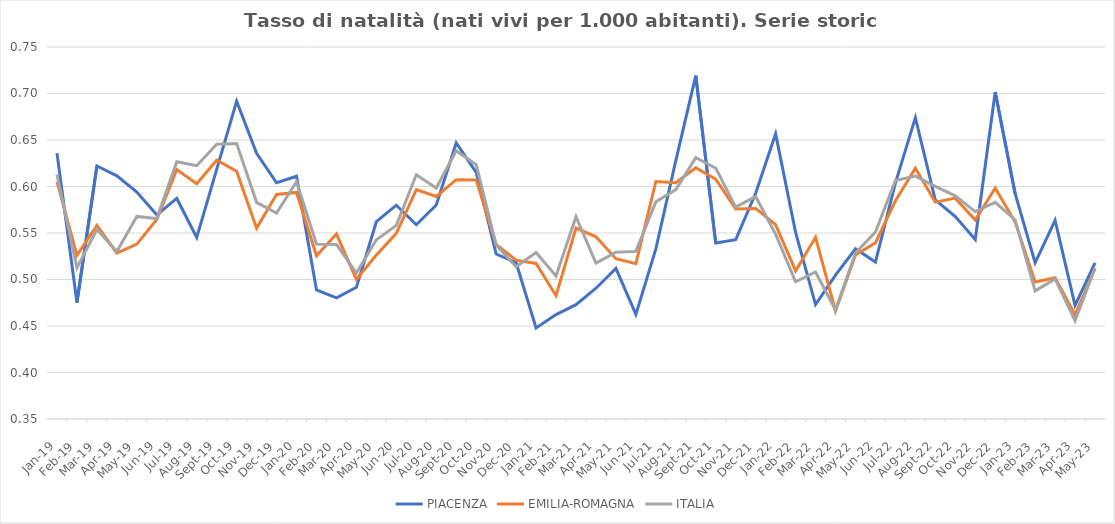
| Category | PIACENZA | EMILIA-ROMAGNA | ITALIA |
|---|---|---|---|
| 2019-01-01 | 0.636 | 0.605 | 0.613 |
| 2019-02-01 | 0.475 | 0.526 | 0.513 |
| 2019-03-01 | 0.622 | 0.558 | 0.554 |
| 2019-04-01 | 0.611 | 0.528 | 0.53 |
| 2019-05-01 | 0.594 | 0.538 | 0.568 |
| 2019-06-01 | 0.569 | 0.564 | 0.566 |
| 2019-07-01 | 0.587 | 0.618 | 0.627 |
| 2019-08-01 | 0.545 | 0.603 | 0.622 |
| 2019-09-01 | 0.618 | 0.628 | 0.645 |
| 2019-10-01 | 0.692 | 0.616 | 0.646 |
| 2019-11-01 | 0.636 | 0.555 | 0.583 |
| 2019-12-01 | 0.604 | 0.591 | 0.572 |
| 2020-01-01 | 0.611 | 0.594 | 0.605 |
| 2020-02-01 | 0.489 | 0.525 | 0.538 |
| 2020-03-01 | 0.48 | 0.549 | 0.538 |
| 2020-04-01 | 0.492 | 0.5 | 0.507 |
| 2020-05-01 | 0.562 | 0.526 | 0.543 |
| 2020-06-01 | 0.58 | 0.55 | 0.558 |
| 2020-07-01 | 0.559 | 0.597 | 0.613 |
| 2020-08-01 | 0.58 | 0.589 | 0.598 |
| 2020-09-01 | 0.647 | 0.607 | 0.639 |
| 2020-10-01 | 0.615 | 0.607 | 0.623 |
| 2020-11-01 | 0.527 | 0.538 | 0.537 |
| 2020-12-01 | 0.518 | 0.521 | 0.514 |
| 2021-01-01 | 0.448 | 0.517 | 0.529 |
| 2021-02-01 | 0.462 | 0.483 | 0.504 |
| 2021-03-01 | 0.473 | 0.555 | 0.568 |
| 2021-04-01 | 0.491 | 0.546 | 0.518 |
| 2021-05-01 | 0.512 | 0.522 | 0.529 |
| 2021-06-01 | 0.463 | 0.517 | 0.53 |
| 2021-07-01 | 0.533 | 0.605 | 0.584 |
| 2021-08-01 | 0.628 | 0.604 | 0.597 |
| 2021-09-01 | 0.719 | 0.62 | 0.631 |
| 2021-10-01 | 0.539 | 0.608 | 0.62 |
| 2021-11-01 | 0.543 | 0.576 | 0.578 |
| 2021-12-01 | 0.593 | 0.576 | 0.589 |
| 2022-01-01 | 0.657 | 0.559 | 0.549 |
| 2022-02-01 | 0.551 | 0.509 | 0.497 |
| 2022-03-01 | 0.473 | 0.545 | 0.508 |
| 2022-04-01 | 0.505 | 0.466 | 0.467 |
| 2022-05-01 | 0.533 | 0.526 | 0.528 |
| 2022-06-01 | 0.519 | 0.539 | 0.551 |
| 2022-07-01 | 0.604 | 0.585 | 0.606 |
| 2022-08-01 | 0.674 | 0.62 | 0.611 |
| 2022-09-01 | 0.585 | 0.583 | 0.6 |
| 2022-10-01 | 0.568 | 0.587 | 0.59 |
| 2022-11-01 | 0.543 | 0.564 | 0.573 |
| 2022-12-01 | 0.702 | 0.598 | 0.583 |
| 2023-01-01 | 0.592 | 0.562 | 0.564 |
| 2023-02-01 | 0.518 | 0.497 | 0.488 |
| 2023-03-01 | 0.564 | 0.502 | 0.501 |
| 2023-04-01 | 0.472 | 0.462 | 0.456 |
| 2023-05-01 | 0.518 | 0.512 | 0.512 |